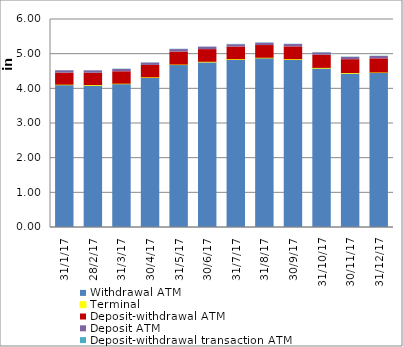
| Category | Withdrawal ATM | Terminal | Deposit-withdrawal ATM | Deposit ATM | Deposit-withdrawal transaction ATM |
|---|---|---|---|---|---|
| 2017-01-31 | 4095 | 10 | 349 | 67 | 8 |
| 2017-02-28 | 4086 | 10 | 354 | 68 | 8 |
| 2017-03-31 | 4124 | 10 | 358 | 68 | 8 |
| 2017-04-30 | 4307 | 10 | 358 | 68 | 8 |
| 2017-05-31 | 4675 | 10 | 375 | 73 | 9 |
| 2017-06-30 | 4756 | 10 | 366 | 68 | 9 |
| 2017-07-31 | 4831 | 10 | 365 | 67 | 9 |
| 2017-08-31 | 4872 | 10 | 367 | 68 | 9 |
| 2017-09-30 | 4831 | 10 | 369 | 68 | 9 |
| 2017-10-31 | 4580 | 10 | 381 | 67 | 9 |
| 2017-11-30 | 4433 | 10 | 398 | 66 | 9 |
| 2017-12-31 | 4446 | 10 | 409 | 67 | 9 |